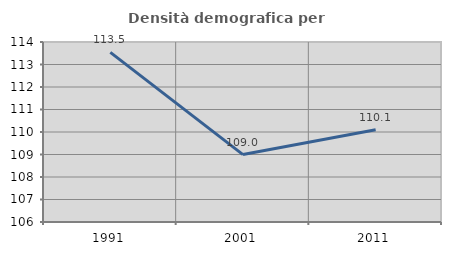
| Category | Densità demografica |
|---|---|
| 1991.0 | 113.538 |
| 2001.0 | 108.997 |
| 2011.0 | 110.104 |